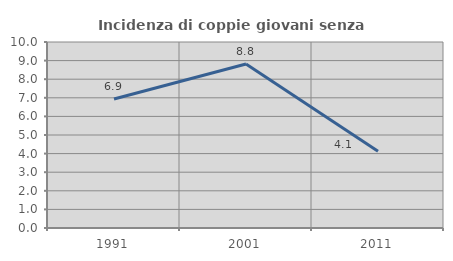
| Category | Incidenza di coppie giovani senza figli |
|---|---|
| 1991.0 | 6.936 |
| 2001.0 | 8.814 |
| 2011.0 | 4.132 |